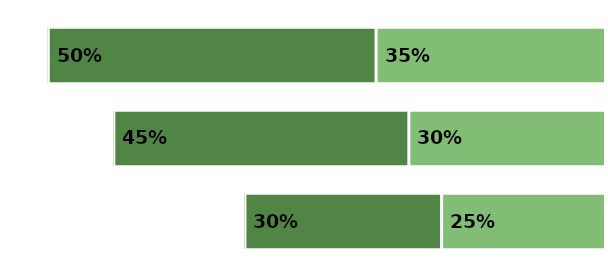
| Category | Agree | Strongly agree |
|---|---|---|
| 0 | 0.25 | 0.3 |
| 1 | 0.3 | 0.45 |
| 2 | 0.35 | 0.5 |